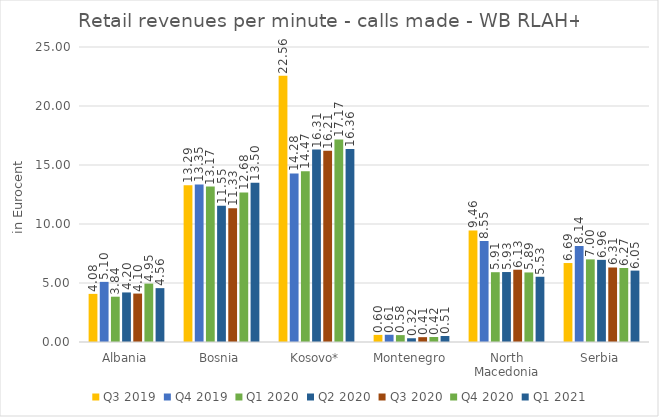
| Category | Q3 2019 | Q4 2019 | Q1 2020 | Q2 2020 | Q3 2020 | Q4 2020 | Q1 2021 |
|---|---|---|---|---|---|---|---|
| Albania | 4.078 | 5.096 | 3.839 | 4.2 | 4.104 | 4.948 | 4.564 |
| Bosnia | 13.293 | 13.351 | 13.17 | 11.548 | 11.334 | 12.678 | 13.497 |
| Kosovo* | 22.561 | 14.28 | 14.467 | 16.313 | 16.212 | 17.172 | 16.359 |
| Montenegro | 0.604 | 0.614 | 0.583 | 0.318 | 0.409 | 0.423 | 0.51 |
| North Macedonia | 9.456 | 8.55 | 5.914 | 5.929 | 6.126 | 5.895 | 5.529 |
| Serbia | 6.692 | 8.145 | 7.001 | 6.961 | 6.314 | 6.27 | 6.05 |